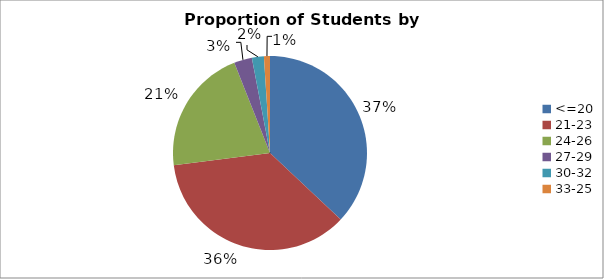
| Category | Series 0 |
|---|---|
| <=20 | 0.37 |
| 21-23 | 0.36 |
| 24-26 | 0.21 |
| 27-29 | 0.03 |
| 30-32 | 0.02 |
| 33-25 | 0.01 |